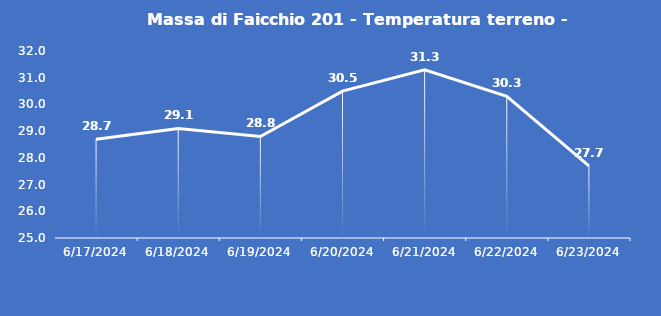
| Category | Massa di Faicchio 201 - Temperatura terreno - Grezzo (°C) |
|---|---|
| 6/17/24 | 28.7 |
| 6/18/24 | 29.1 |
| 6/19/24 | 28.8 |
| 6/20/24 | 30.5 |
| 6/21/24 | 31.3 |
| 6/22/24 | 30.3 |
| 6/23/24 | 27.7 |